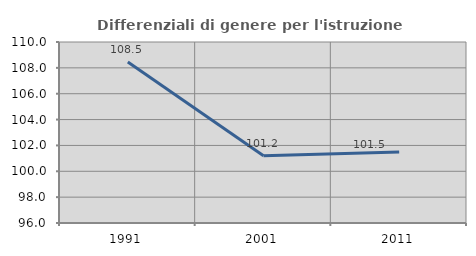
| Category | Differenziali di genere per l'istruzione superiore |
|---|---|
| 1991.0 | 108.454 |
| 2001.0 | 101.195 |
| 2011.0 | 101.493 |